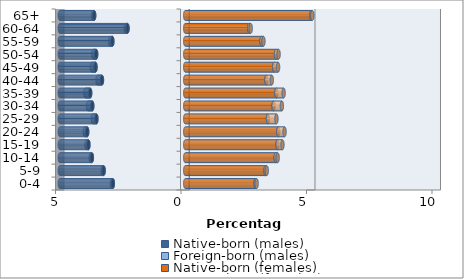
| Category | Native-born (males) | Foreign-born (males) | Native-born (females) | Foreign-born (females) |
|---|---|---|---|---|
| 0-4 | -2.885 | -0.037 | 2.8 | 0.044 |
| 5-9 | -3.253 | -0.036 | 3.198 | 0.049 |
| 10-14 | -3.721 | -0.043 | 3.603 | 0.078 |
| 15-19 | -3.859 | -0.075 | 3.68 | 0.192 |
| 20-24 | -3.908 | -0.094 | 3.708 | 0.248 |
| 25-29 | -3.54 | -0.142 | 3.294 | 0.339 |
| 30-34 | -3.705 | -0.169 | 3.52 | 0.329 |
| 35-39 | -3.789 | -0.188 | 3.631 | 0.287 |
| 40-44 | -3.32 | -0.173 | 3.232 | 0.215 |
| 45-49 | -3.576 | -0.145 | 3.547 | 0.151 |
| 50-54 | -3.55 | -0.11 | 3.616 | 0.101 |
| 55-59 | -2.905 | -0.084 | 3.041 | 0.074 |
| 60-64 | -2.301 | -0.068 | 2.552 | 0.056 |
| 65+ | -3.629 | -0.045 | 5.022 | 0.04 |